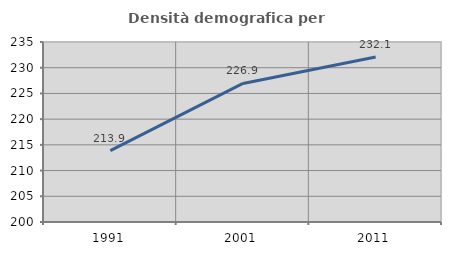
| Category | Densità demografica |
|---|---|
| 1991.0 | 213.887 |
| 2001.0 | 226.941 |
| 2011.0 | 232.087 |